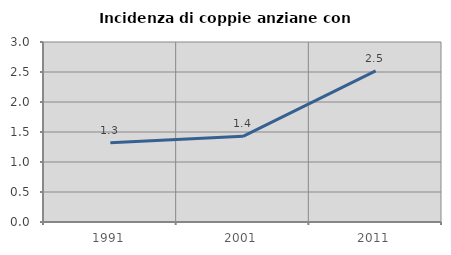
| Category | Incidenza di coppie anziane con figli |
|---|---|
| 1991.0 | 1.322 |
| 2001.0 | 1.429 |
| 2011.0 | 2.518 |